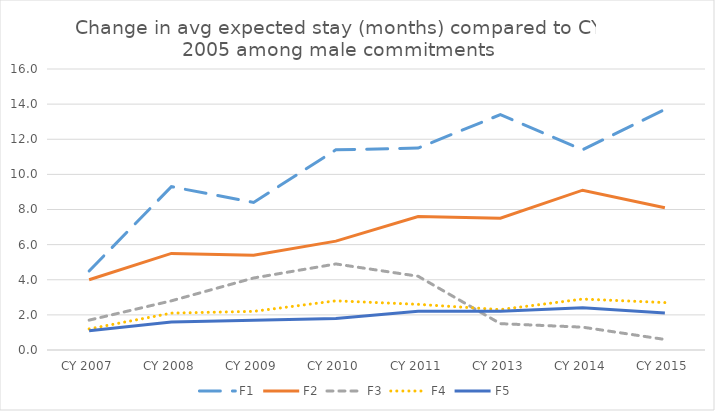
| Category | F1 | F2 | F3 | F4 | F5 |
|---|---|---|---|---|---|
| CY 2007 | 4.5 | 4 | 1.7 | 1.2 | 1.1 |
| CY 2008 | 9.3 | 5.5 | 2.8 | 2.1 | 1.6 |
| CY 2009 | 8.4 | 5.4 | 4.1 | 2.2 | 1.7 |
| CY 2010 | 11.4 | 6.2 | 4.9 | 2.8 | 1.8 |
| CY 2011 | 11.5 | 7.6 | 4.2 | 2.6 | 2.2 |
| CY 2013 | 13.4 | 7.5 | 1.5 | 2.3 | 2.2 |
| CY 2014 | 11.4 | 9.1 | 1.3 | 2.9 | 2.4 |
| CY 2015 | 13.7 | 8.1 | 0.6 | 2.7 | 2.1 |